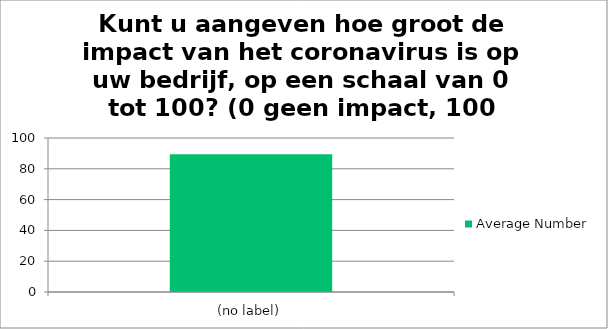
| Category | Average Number |
|---|---|
| (no label) | 89.403 |